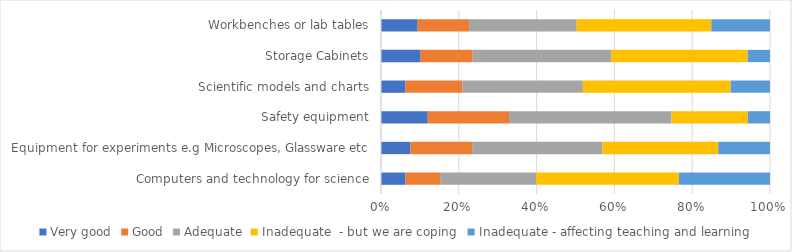
| Category | Very good | Good | Adequate | Inadequate  - but we are coping  | Inadequate - affecting teaching and learning |
|---|---|---|---|---|---|
| Computers and technology for science | 0.063 | 0.089 | 0.247 | 0.367 | 0.234 |
| Equipment for experiments e.g Microscopes, Glassware etc | 0.076 | 0.158 | 0.335 | 0.297 | 0.133 |
| Safety equipment | 0.12 | 0.209 | 0.418 | 0.196 | 0.057 |
| Scientific models and charts | 0.063 | 0.146 | 0.31 | 0.38 | 0.101 |
| Storage Cabinets | 0.102 | 0.134 | 0.357 | 0.35 | 0.057 |
| Workbenches or lab tables | 0.094 | 0.132 | 0.277 | 0.346 | 0.151 |